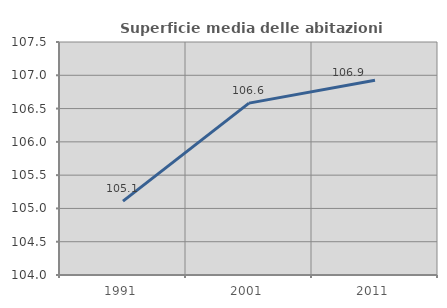
| Category | Superficie media delle abitazioni occupate |
|---|---|
| 1991.0 | 105.109 |
| 2001.0 | 106.582 |
| 2011.0 | 106.924 |